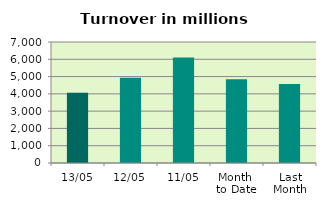
| Category | Series 0 |
|---|---|
| 13/05 | 4066.003 |
| 12/05 | 4927.212 |
| 11/05 | 6102.53 |
| Month 
to Date | 4847.629 |
| Last
Month | 4573.802 |